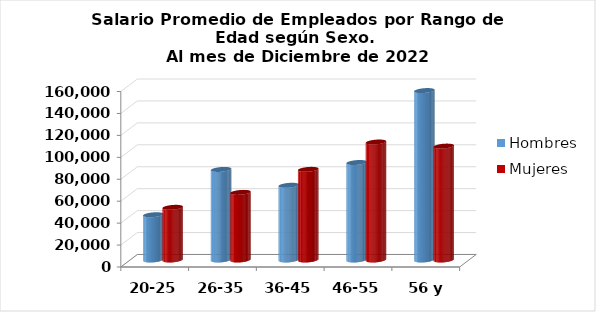
| Category | Hombres | Mujeres |
|---|---|---|
| 20-25 | 41266.667 | 48014.792 |
| 26-35 | 82579.13 | 61658.23 |
| 36-45 | 68127.056 | 82639.831 |
| 46-55 | 88888.636 | 107558.542 |
| 56 y más | 154479.545 | 103838.187 |